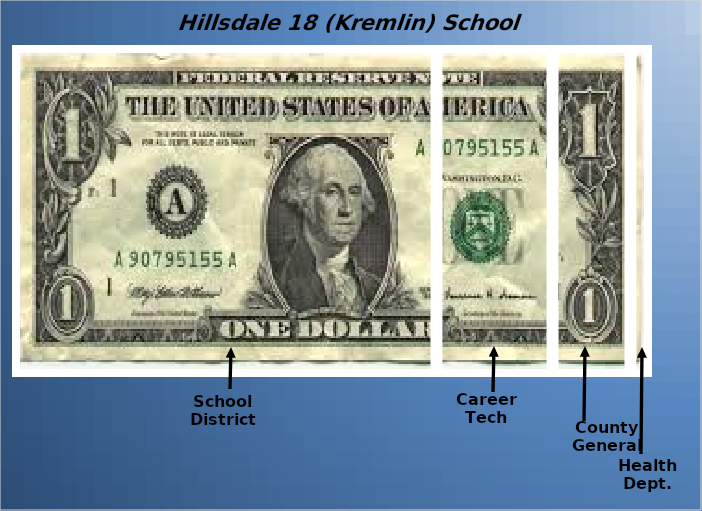
| Category | School District | Career Tech | County General | Health Dept. |
|---|---|---|---|---|
| 0 | 0.664 | 0.183 | 0.123 | 0.031 |